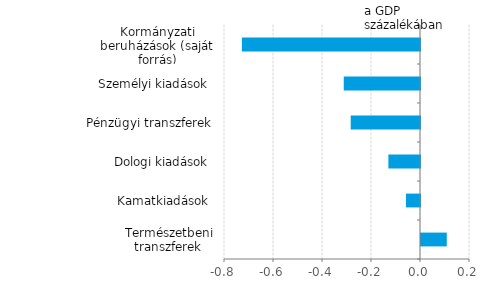
| Category | Series 0 |
|---|---|
| Természetbeni transzferek  | 0.105 |
| Kamatkiadások  | -0.057 |
| Dologi kiadások  | -0.129 |
| Pénzügyi transzferek | -0.283 |
| Személyi kiadások  | -0.311 |
| Kormányzati beruházások (saját forrás) | -0.727 |